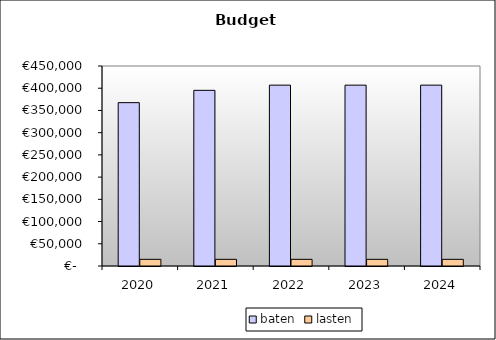
| Category | baten | lasten |
|---|---|---|
| 2020.0 | 367543.25 | 15000 |
| 2021.0 | 395253.97 | 15000 |
| 2022.0 | 406930.28 | 15000 |
| 2023.0 | 406930.28 | 15000 |
| 2024.0 | 406930.28 | 15000 |